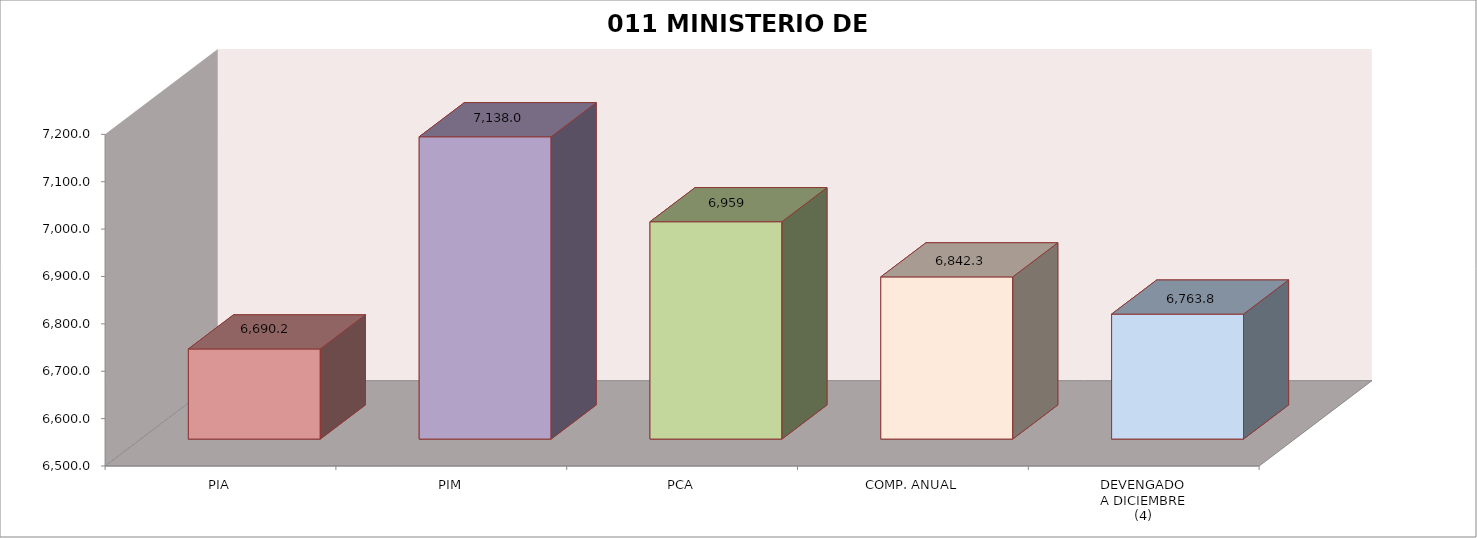
| Category | 011 MINISTERIO DE SALUD |
|---|---|
| PIA | 6690.187 |
| PIM | 7138.024 |
| PCA | 6958.712 |
| COMP. ANUAL | 6842.283 |
| DEVENGADO
A DICIEMBRE
(4) | 6763.762 |